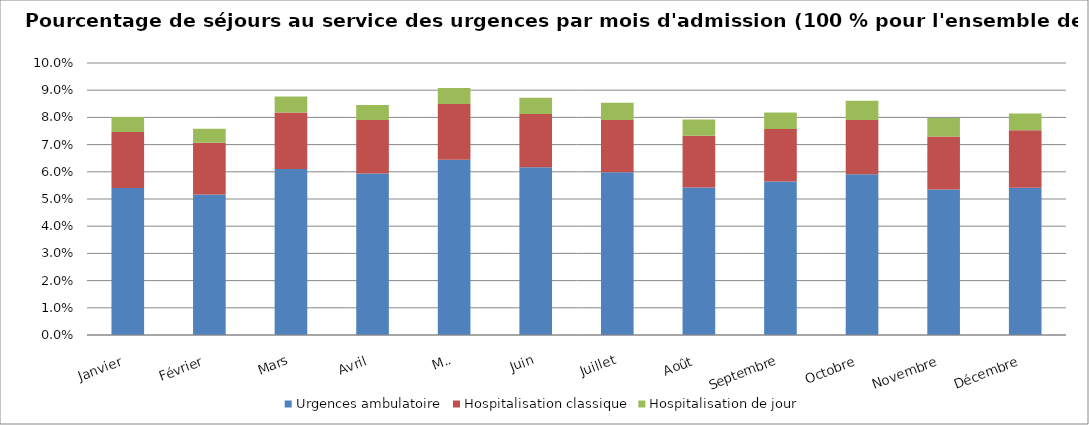
| Category | Urgences ambulatoire | Hospitalisation classique | Hospitalisation de jour |
|---|---|---|---|
| Janvier | 0.054 | 0.021 | 0.006 |
| Février | 0.052 | 0.019 | 0.005 |
| Mars | 0.061 | 0.021 | 0.006 |
| Avril | 0.059 | 0.02 | 0.006 |
| Mai | 0.064 | 0.021 | 0.006 |
| Juin | 0.062 | 0.02 | 0.006 |
| Juillet | 0.06 | 0.019 | 0.006 |
| Août | 0.054 | 0.019 | 0.006 |
| Septembre | 0.056 | 0.019 | 0.006 |
| Octobre | 0.059 | 0.02 | 0.007 |
| Novembre | 0.054 | 0.019 | 0.007 |
| Décembre | 0.054 | 0.021 | 0.006 |